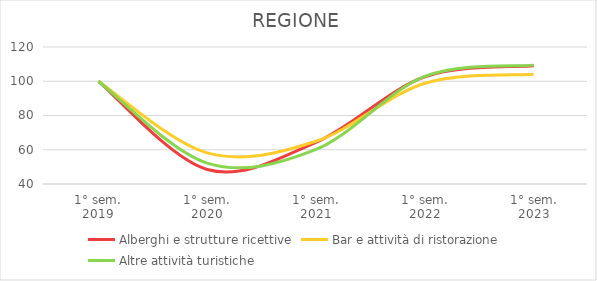
| Category | Alberghi e strutture ricettive | Bar e attività di ristorazione | Altre attività turistiche |
|---|---|---|---|
| 1° sem.
2019 | 100 | 100 | 100 |
| 1° sem.
2020 | 48.464 | 58.169 | 52.222 |
| 1° sem.
2021 | 64.358 | 64.98 | 60.182 |
| 1° sem.
2022 | 102.64 | 98.85 | 102.846 |
| 1° sem.
2023 | 109.092 | 104.113 | 109.417 |